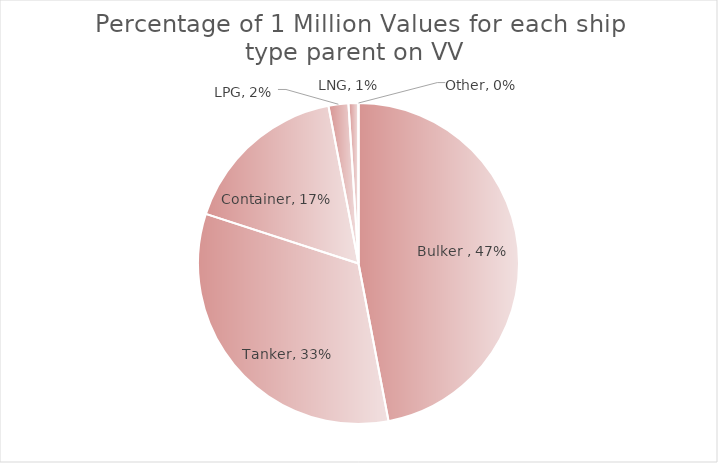
| Category | Series 0 |
|---|---|
| Bulker  | 0.47 |
| Tanker | 0.33 |
| Container | 0.17 |
| LPG | 0.02 |
| LNG | 0.01 |
| Other | 0 |